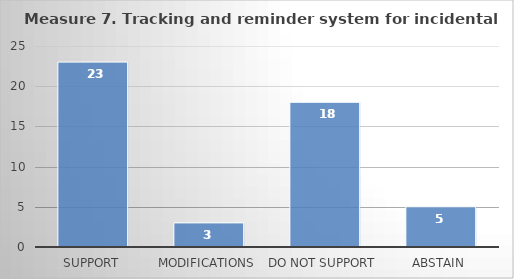
| Category | Series 0 |
|---|---|
| Support | 23 |
| Modifications | 3 |
| Do not support | 18 |
| Abstain | 5 |